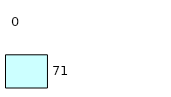
| Category | Series 0 | Series 1 |
|---|---|---|
| 0 | 71 | 0 |